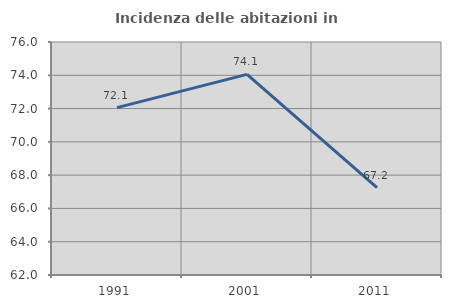
| Category | Incidenza delle abitazioni in proprietà  |
|---|---|
| 1991.0 | 72.059 |
| 2001.0 | 74.057 |
| 2011.0 | 67.247 |